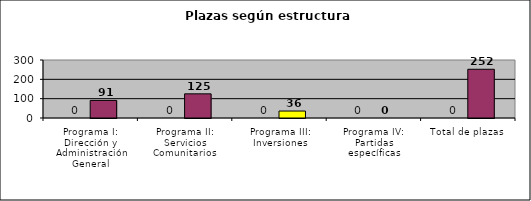
| Category | Series 0 | Series 1 |
|---|---|---|
| Programa I: Dirección y Administración General |  | 91 |
| Programa II: Servicios Comunitarios |  | 125 |
| Programa III: Inversiones |  | 36 |
| Programa IV: Partidas específicas |  | 0 |
| Total de plazas |  | 252 |